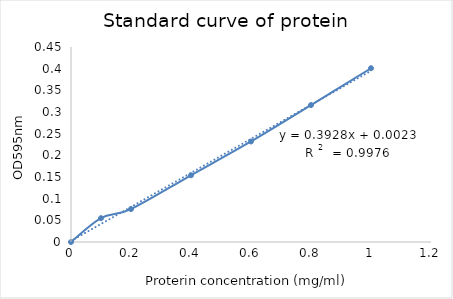
| Category | OD595nm |
|---|---|
| 0.0 | 0 |
| 0.1 | 0.055 |
| 0.2 | 0.076 |
| 0.4 | 0.154 |
| 0.6 | 0.232 |
| 0.8 | 0.316 |
| 1.0 | 0.401 |